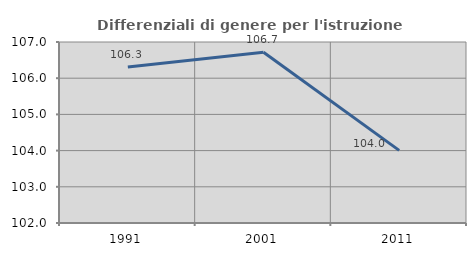
| Category | Differenziali di genere per l'istruzione superiore |
|---|---|
| 1991.0 | 106.312 |
| 2001.0 | 106.719 |
| 2011.0 | 104.007 |